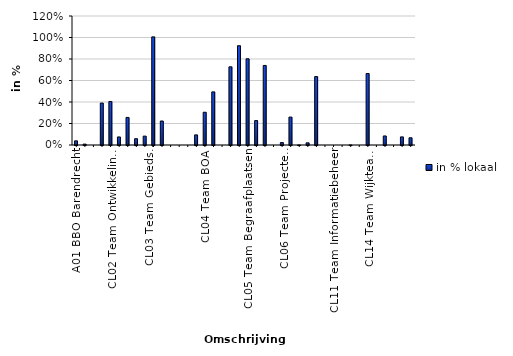
| Category | in % lokaal |
|---|---|
| A01 BBO Barendrecht | 0.039 |
| Griffie Barendrecht | 0.008 |
| A06 Team Financieel Specialisten | 0 |
| CL01 Team Exploitatie en Verhuur | 0.39 |
| CL01 Team Beleid en Projecten | 0.405 |
| CL02 Team Ontwikkeling leefomgeving | 0.075 |
| CL02 Team Kwaliteit leefomgeving | 0.257 |
| CL02 Team Energietransitie en Klimaatadaptatie | 0.058 |
| CL02 Team Verkeer en Mobiliteit | 0.083 |
| CL03 Team Ruimtelijke ordening | 1.006 |
| CL03 Team Gebiedsontwikkeling haalbaarheid | 0.223 |
| CL03 Team WABO-toezicht en Juridische handhaving | 0 |
| CL03 Team Omgevingsvergunningen | 0 |
| CL04 Team APV en Bijzondere wetten | 0 |
| CL04 Team Openbare orde en Veiligheid | 0.094 |
| CL04 Team BOA | 0.305 |
| CL05 Team Wijkbeheer | 0.494 |
| CL05 Team Reiniging | 0 |
| CL05 Team Bomen, Borden en Spelen | 0.727 |
| CL05 Team Toezicht | 0.924 |
| CL05 Team Begraafplaatsen | 0.802 |
| CL06 Team Beheer | 0.227 |
| CL06 Team Beleid inrichting en beheer | 0.74 |
| CL06 Team Werkvoorbereiding, Kabels en Leidingen | 0 |
| CL06 Team Ondersteuning en Advies | 0.022 |
| CL06 Team Projecten buitenruimte | 0.26 |
| CL06 Team Detachering NV BAR Afvalbeheer | 0 |
| CL07 Team Backoffice | 0.02 |
| CL10 Team Rechtsbescherming | 0.636 |
| CL10 Team Juridische dienstverl. en Verzekeringen | 0 |
| CL11 Team Informatiebeheer | 0 |
| CL11 Team Operatie en Diensten | 0 |
| CL13 Team Wijkteam 1 en 2 Barendrecht
 | 0 |
| CL13 Team Wijkteam 3 en 4 Barendrecht | 0 |
| CL12 Team Beleid en Ontwikkeling Maatsch.Zaken | 0.665 |
| CL14 Team Wijkteam Albrandswaard | 0 |
| CL14 Team WMO | 0.084 |
| CL12 Team Inkomen / Poort | 0 |
| CL12 Team Participatie 1 | 0.075 |
| CL13 Team SDV / Leerplicht / KCC | 0.067 |